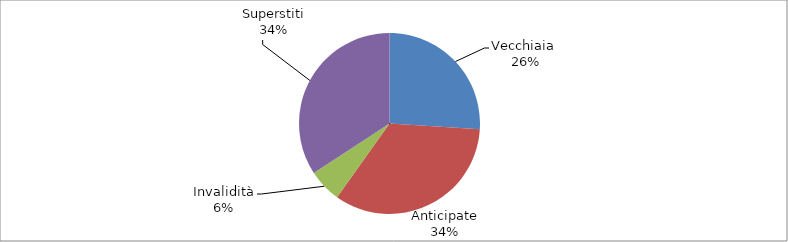
| Category | Series 0 |
|---|---|
| Vecchiaia  | 22228 |
| Anticipate | 28951 |
| Invalidità | 5069 |
| Superstiti | 29271 |